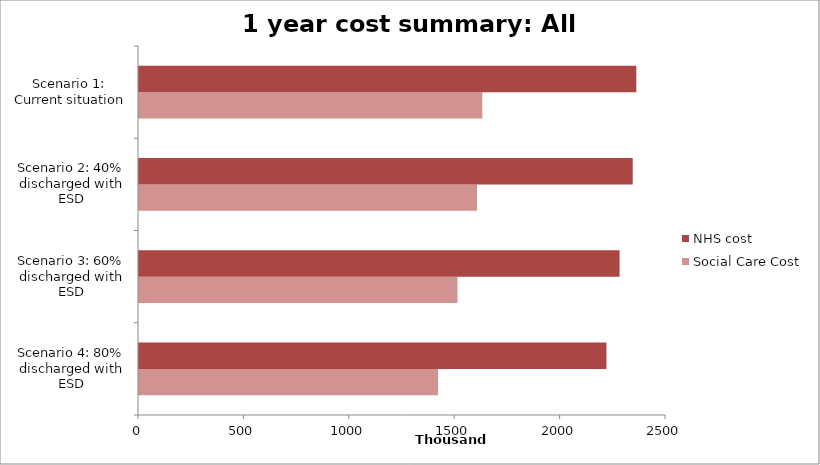
| Category | Social Care Cost | NHS cost |
|---|---|---|
| Scenario 4: 80% discharged with ESD | 1418696.68 | 2217531.4 |
| Scenario 3: 60% discharged with ESD | 1511039.46 | 2279831.8 |
| Scenario 2: 40% discharged with ESD | 1603382.24 | 2342132.2 |
| Scenario 1: Current situation | 1628776.504 | 2359264.81 |